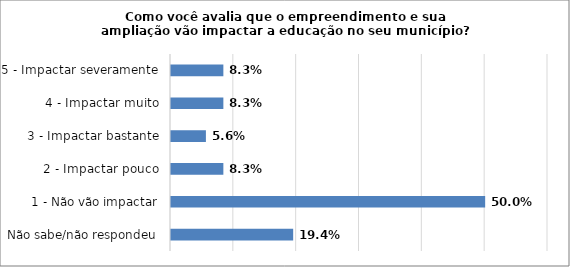
| Category | Series 0 |
|---|---|
| Não sabe/não respondeu | 0.194 |
| 1 - Não vão impactar | 0.5 |
| 2 - Impactar pouco | 0.083 |
| 3 - Impactar bastante | 0.056 |
| 4 - Impactar muito | 0.083 |
| 5 - Impactar severamente | 0.083 |